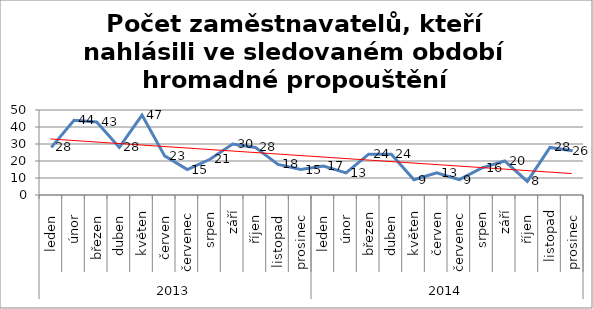
| Category | počet zaměstnavatelů, kteří nahlásili ve sledovaném období hromadné propouštění |
|---|---|
| 0 | 28 |
| 1 | 44 |
| 2 | 43 |
| 3 | 28 |
| 4 | 47 |
| 5 | 23 |
| 6 | 15 |
| 7 | 21 |
| 8 | 30 |
| 9 | 28 |
| 10 | 18 |
| 11 | 15 |
| 12 | 17 |
| 13 | 13 |
| 14 | 24 |
| 15 | 24 |
| 16 | 9 |
| 17 | 13 |
| 18 | 9 |
| 19 | 16 |
| 20 | 20 |
| 21 | 8 |
| 22 | 28 |
| 23 | 26 |